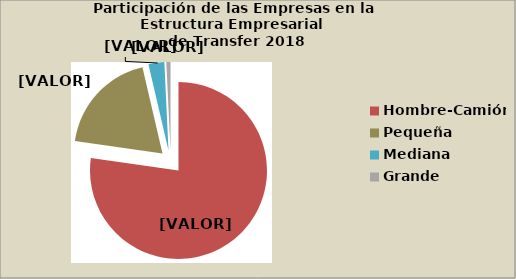
| Category | Series 0 |
|---|---|
| Hombre-Camión | 77.248 |
| Pequeña | 19.109 |
| Mediana | 2.891 |
| Grande | 0.752 |